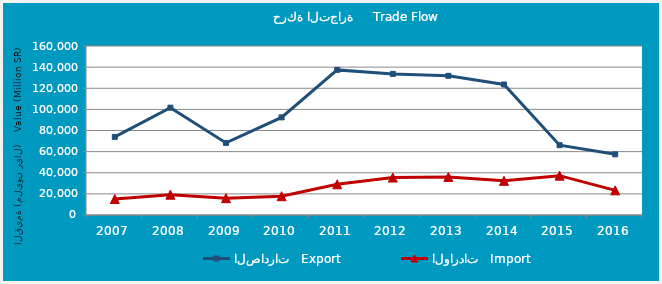
| Category | الصادرات   Export | الواردات   Import |
|---|---|---|
| 2007.0 | 73971.952 | 15161.644 |
| 2008.0 | 101620.83 | 19218.06 |
| 2009.0 | 68262.76 | 15931.338 |
| 2010.0 | 92430.869 | 17788.584 |
| 2011.0 | 137391.878 | 29075.665 |
| 2012.0 | 133585.017 | 35467.027 |
| 2013.0 | 131750.082 | 36017.849 |
| 2014.0 | 123557.035 | 32336.135 |
| 2015.0 | 66099.107 | 37250.641 |
| 2016.0 | 57432.485 | 23327.731 |